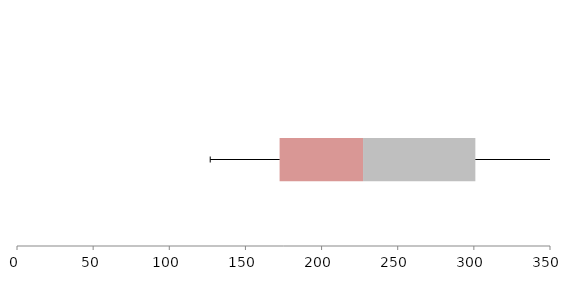
| Category | Series 1 | Series 2 | Series 3 |
|---|---|---|---|
| 0 | 172.441 | 54.789 | 73.754 |